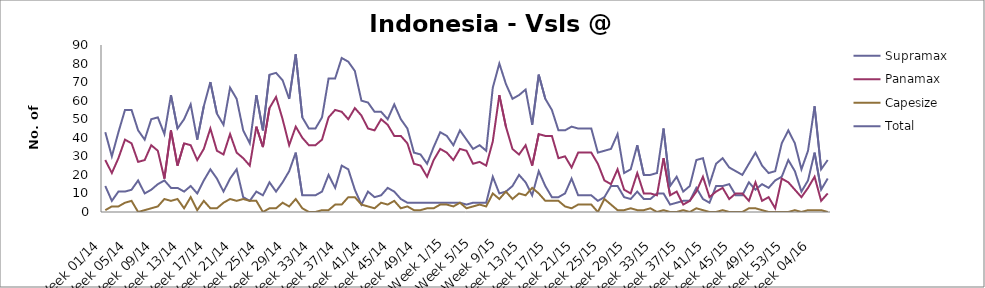
| Category | Supramax | Panamax | Capesize | Total |
|---|---|---|---|---|
| Week 01/14 | 14 | 28 | 1 | 43 |
| Week 02/14 | 6 | 21 | 3 | 30 |
| Week 03/14 | 11 | 29 | 3 | 43 |
| Week 04/14 | 11 | 39 | 5 | 55 |
| Week 05/14 | 12 | 37 | 6 | 55 |
| Week 06/14 | 17 | 27 | 0 | 44 |
| Week 07/14 | 10 | 28 | 1 | 39 |
| Week 08/14 | 12 | 36 | 2 | 50 |
| Week 09/14 | 15 | 33 | 3 | 51 |
| Week 10/14 | 17 | 18 | 7 | 42 |
| Week 11/14 | 13 | 44 | 6 | 63 |
| Week 12/14 | 13 | 25 | 7 | 45 |
| Week 13/14 | 11 | 37 | 2 | 50 |
| Week 14/14 | 14 | 36 | 8 | 58 |
| Week 15/14 | 10 | 28 | 1 | 39 |
| Week 16/14 | 17 | 34 | 6 | 57 |
| Week 17/14 | 23 | 45 | 2 | 70 |
| Week 18/14 | 18 | 33 | 2 | 53 |
| Week 19/14 | 11 | 31 | 5 | 47 |
| Week 20/14 | 18 | 42 | 7 | 67 |
| Week 21/14 | 23 | 32 | 6 | 61 |
| Week 22/14 | 8 | 29 | 7 | 44 |
| Week 23/14 | 6 | 25 | 6 | 37 |
| Week 24/14 | 11 | 46 | 6 | 63 |
| Week 25/14 | 9 | 35 | 0 | 44 |
| Week 26/14 | 16 | 56 | 2 | 74 |
| Week 27/14 | 11 | 62 | 2 | 75 |
| Week 28/14 | 16 | 50 | 5 | 71 |
| Week 29/14 | 22 | 36 | 3 | 61 |
| Week 30/14 | 32 | 46 | 7 | 85 |
| Week 31/14 | 9 | 40 | 2 | 51 |
| Week 32/14 | 9 | 36 | 0 | 45 |
| Week 33/14 | 9 | 36 | 0 | 45 |
| Week 34/14 | 11 | 39 | 1 | 51 |
| Week 35/14 | 20 | 51 | 1 | 72 |
| Week 36/14 | 13 | 55 | 4 | 72 |
| Week 37/14 | 25 | 54 | 4 | 83 |
| Week 38/14 | 23 | 50 | 8 | 81 |
| Week 39/14 | 12 | 56 | 8 | 76 |
| Week 40/14 | 4 | 52 | 4 | 60 |
| Week 41/14 | 11 | 45 | 3 | 59 |
| Week 42/14 | 8 | 44 | 2 | 54 |
| Week 43/14 | 9 | 50 | 5 | 54 |
| Week 44/14 | 13 | 47 | 4 | 50 |
| Week 45/14 | 11 | 41 | 6 | 58 |
| Week 46/14 | 7 | 41 | 2 | 50 |
| Week 47/14 | 5 | 37 | 3 | 45 |
| Week 48/14 | 5 | 26 | 1 | 32 |
| Week 49/14 | 5 | 25 | 1 | 31 |
| Week 50/14 | 5 | 19 | 2 | 26 |
| Week 51/14 | 5 | 28 | 2 | 35 |
| Week 52/14 | 5 | 34 | 4 | 43 |
| Week 1/15 | 5 | 32 | 4 | 41 |
| Week 2/15 | 5 | 28 | 3 | 36 |
| Week 3/15 | 5 | 34 | 5 | 44 |
| Week 4/15 | 4 | 33 | 2 | 39 |
| Week 5/15 | 5 | 26 | 3 | 34 |
| Week 6/15 | 5 | 27 | 4 | 36 |
| Week 7/15 | 5 | 25 | 3 | 33 |
| Week 8/15 | 19 | 38 | 10 | 67 |
| Week 9/15 | 10 | 63 | 7 | 80 |
| Week 10/15 | 11 | 46 | 11 | 69 |
| Week 11/15 | 14 | 34 | 7 | 61 |
| Week 12/15 | 20 | 31 | 10 | 63 |
| Week 13/15 | 16 | 36 | 9 | 66 |
| Week 14/15 | 9 | 25 | 13 | 47 |
| Week 15/15 | 22 | 42 | 10 | 74 |
| Week 16/15 | 14 | 41 | 6 | 61 |
| Week 17/15 | 8 | 41 | 6 | 55 |
| Week 18/15 | 8 | 29 | 6 | 44 |
| Week 19/15 | 10 | 30 | 3 | 44 |
| Week 20/15 | 18 | 24 | 2 | 46 |
| Week 21/15 | 9 | 32 | 4 | 45 |
| Week 22/15 | 9 | 32 | 4 | 45 |
| Week 23/15 | 9 | 32 | 4 | 45 |
| Week 24/15 | 6 | 26 | 0 | 32 |
| Week 25/15 | 8 | 17 | 7 | 33 |
| Week 26/15 | 14 | 15 | 4 | 34 |
| Week 27/15 | 14 | 23 | 1 | 42 |
| Week 28/15 | 8 | 12 | 1 | 21 |
| Week 29/15 | 7 | 10 | 2 | 23 |
| Week 30/15 | 11 | 21 | 1 | 36 |
| Week 31/15 | 7 | 10 | 1 | 20 |
| Week 32/15 | 7 | 10 | 2 | 20 |
| Week 33/15 | 10 | 9 | 0 | 21 |
| Week 34/15 | 10 | 29 | 1 | 45 |
| Week 35/15 | 4 | 9 | 0 | 14 |
| Week 36/15 | 5 | 11 | 0 | 19 |
| Week 37/15 | 6 | 4 | 1 | 11 |
| Week 38/15 | 6 | 6 | 0 | 14 |
| Week 39/15 | 13 | 11 | 2 | 28 |
| Week 40/15 | 7 | 19 | 1 | 29 |
| Week 41/15 | 5 | 8 | 0 | 15 |
| Week 42/15 | 14 | 11 | 0 | 26 |
| Week 43/15 | 14 | 13 | 1 | 29 |
| Week 44/15 | 15 | 7 | 0 | 24 |
| Week 45/15 | 9 | 10 | 0 | 22 |
| Week 46/15 | 9 | 10 | 0 | 20 |
| Week 47/15 | 16 | 6 | 2 | 26 |
| Week 48/15 | 12 | 16 | 2 | 32 |
| Week 49/15 | 15 | 6 | 1 | 25 |
| Week 50/15 | 13 | 8 | 0 | 21 |
| Week 51/15 | 17 | 2 | 0 | 22 |
| Week 52/15 | 19 | 18 | 0 | 37 |
| Week 53/15 | 28 | 16 | 0 | 44 |
| Week 01/16 | 22 | 12 | 1 | 37 |
| Week 02/16 | 11 | 8 | 0 | 23 |
| Week 03/16 | 17 | 13 | 1 | 33 |
| Week 04/16 | 32 | 19 | 1 | 57 |
| Week 05/16 | 12 | 6 | 1 | 23 |
| Week 06/16 | 18 | 10 | 0 | 28 |